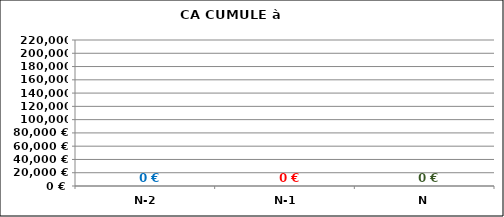
| Category | Series 0 |
|---|---|
| N-2 | 0 |
| N-1 | 0 |
| N | 0 |